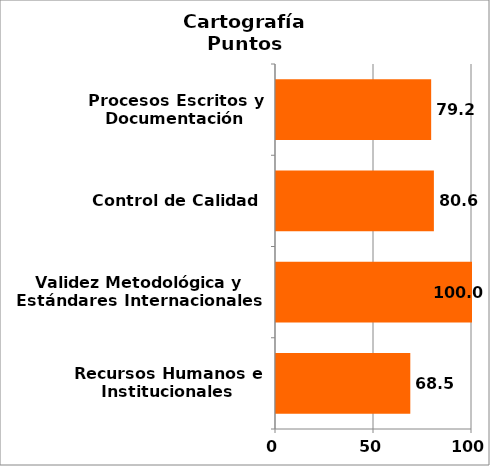
| Category | Series 0 |
|---|---|
| Recursos Humanos e Institucionales | 68.519 |
| Validez Metodológica y Estándares Internacionales | 100 |
| Control de Calidad | 80.556 |
| Procesos Escritos y Documentación | 79.167 |